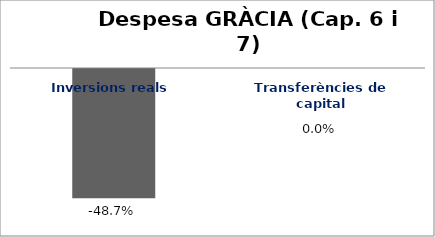
| Category | Series 0 |
|---|---|
| Inversions reals | -0.487 |
| Transferències de capital | 0 |